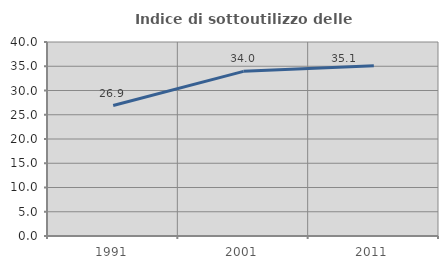
| Category | Indice di sottoutilizzo delle abitazioni  |
|---|---|
| 1991.0 | 26.893 |
| 2001.0 | 33.951 |
| 2011.0 | 35.128 |